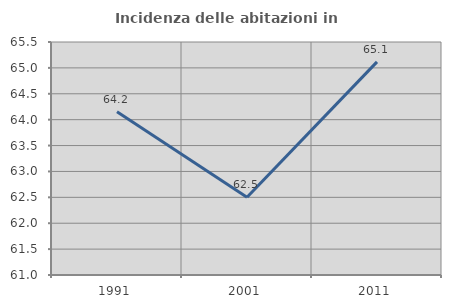
| Category | Incidenza delle abitazioni in proprietà  |
|---|---|
| 1991.0 | 64.151 |
| 2001.0 | 62.5 |
| 2011.0 | 65.116 |